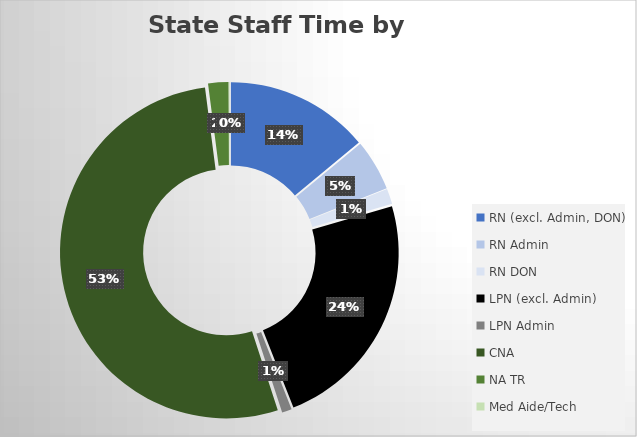
| Category | Series 0 |
|---|---|
| RN (excl. Admin, DON) | 32682.104 |
| RN Admin | 11637.459 |
| RN DON | 3501.959 |
| LPN (excl. Admin) | 55069.398 |
| LPN Admin | 2240.095 |
| CNA | 123816.656 |
| NA TR | 4616.996 |
| Med Aide/Tech | 159.175 |